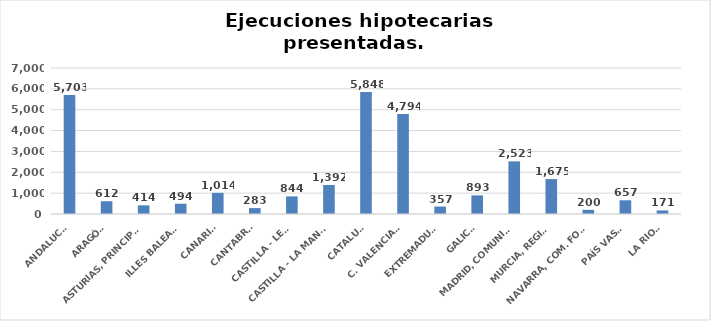
| Category | Series 0 |
|---|---|
| ANDALUCÍA | 5703 |
| ARAGÓN | 612 |
| ASTURIAS, PRINCIPADO | 414 |
| ILLES BALEARS | 494 |
| CANARIAS | 1014 |
| CANTABRIA | 283 |
| CASTILLA - LEÓN | 844 |
| CASTILLA - LA MANCHA | 1392 |
| CATALUÑA | 5848 |
| C. VALENCIANA | 4794 |
| EXTREMADURA | 357 |
| GALICIA | 893 |
| MADRID, COMUNIDAD | 2523 |
| MURCIA, REGIÓN | 1675 |
| NAVARRA, COM. FORAL | 200 |
| PAÍS VASCO | 657 |
| LA RIOJA | 171 |